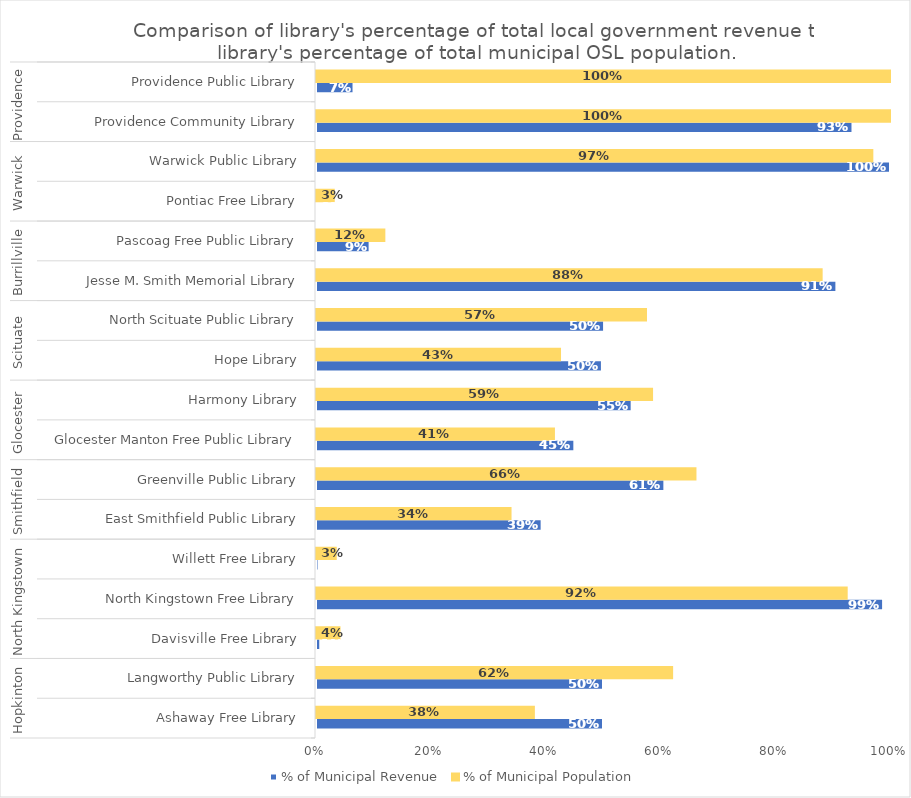
| Category | % of Municipal Revenue | % of Municipal Population |
|---|---|---|
| 0 | 0.5 | 0.38 |
| 1 | 0.5 | 0.62 |
| 2 | 0.008 | 0.041 |
| 3 | 0.988 | 0.925 |
| 4 | 0.005 | 0.034 |
| 5 | 0.393 | 0.339 |
| 6 | 0.607 | 0.661 |
| 7 | 0.45 | 0.415 |
| 8 | 0.55 | 0.585 |
| 9 | 0.498 | 0.425 |
| 10 | 0.502 | 0.575 |
| 11 | 0.907 | 0.881 |
| 12 | 0.093 | 0.119 |
| 13 | 0 | 0.031 |
| 14 | 1 | 0.969 |
| 15 | 0.935 | 1 |
| 16 | 0.065 | 1 |